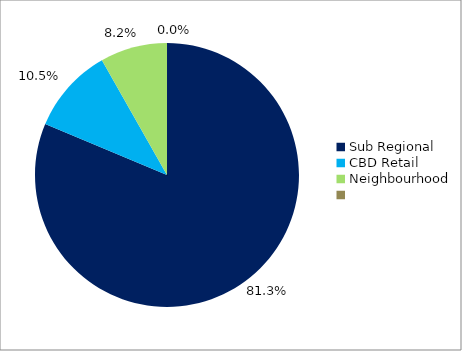
| Category | Series 0 |
|---|---|
| Sub Regional | 0.813 |
| CBD Retail | 0.105 |
| Neighbourhood | 0.082 |